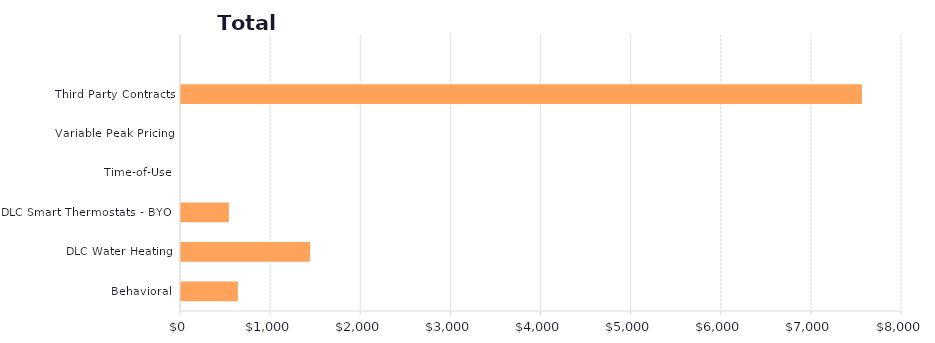
| Category | Series 1 |
|---|---|
| Behavioral | 631.431 |
| DLC Water Heating | 1432.608 |
| DLC Smart Thermostats - BYOT | 531.57 |
| Time-of-Use | 0 |
| Variable Peak Pricing | 0 |
| Third Party Contracts | 7555.283 |